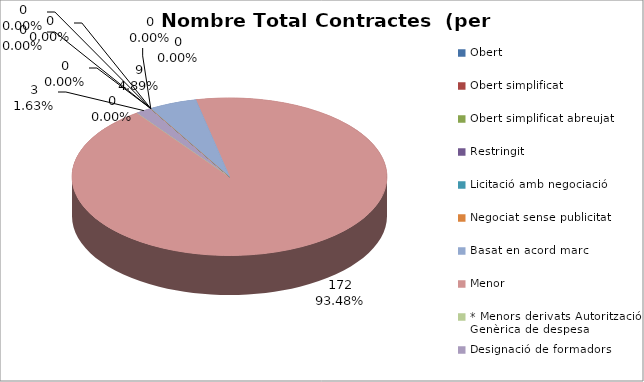
| Category | Nombre Total Contractes |
|---|---|
| Obert | 0 |
| Obert simplificat | 0 |
| Obert simplificat abreujat | 0 |
| Restringit | 0 |
| Licitació amb negociació | 0 |
| Negociat sense publicitat | 0 |
| Basat en acord marc | 9 |
| Menor | 172 |
| * Menors derivats Autorització Genèrica de despesa | 0 |
| Designació de formadors | 3 |